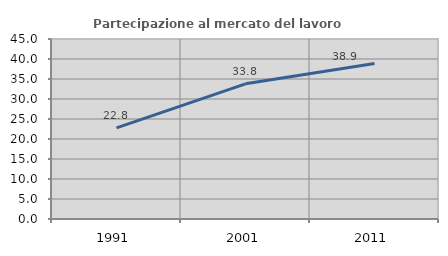
| Category | Partecipazione al mercato del lavoro  femminile |
|---|---|
| 1991.0 | 22.785 |
| 2001.0 | 33.793 |
| 2011.0 | 38.854 |